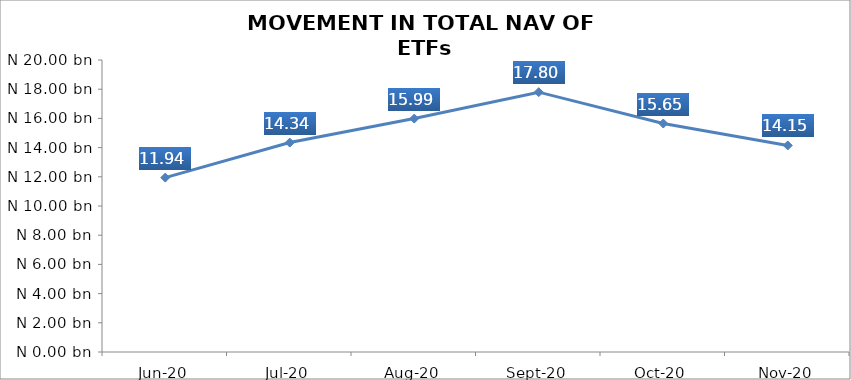
| Category | Series 0 |
|---|---|
| 2020-06-01 | 11944935776.22 |
| 2020-07-01 | 14343728259.45 |
| 2020-08-01 | 15987397591.7 |
| 2020-09-01 | 17796594275.01 |
| 2020-10-01 | 15650550930.52 |
| 2020-11-01 | 14147234611.75 |